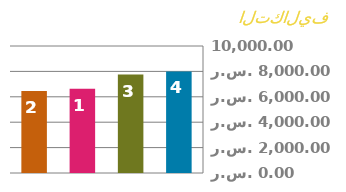
| Category | المقدم |
|---|---|
| 0 | 8000 |
| 1 | 7750 |
| 2 | 6625 |
| 3 | 6450 |